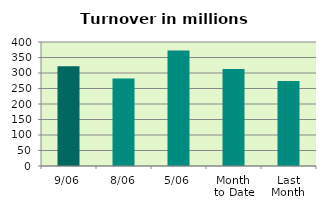
| Category | Series 0 |
|---|---|
| 9/06 | 321.893 |
| 8/06 | 282.236 |
| 5/06 | 372.232 |
| Month 
to Date | 313.029 |
| Last
Month | 273.813 |